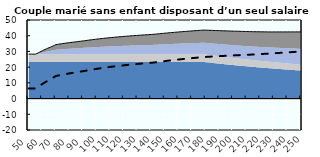
| Category | Coin fiscal moyen (somme des composantes) | Taux moyen d'imposition net en % du salaire brut |
|---|---|---|
| 50.0 | 28.259 | 6.45 |
| 51.0 | 28.259 | 6.45 |
| 52.0 | 28.259 | 6.45 |
| 53.0 | 28.259 | 6.45 |
| 54.0 | 28.259 | 6.45 |
| 55.0 | 28.259 | 6.45 |
| 56.0 | 28.616 | 6.915 |
| 57.0 | 29.094 | 7.539 |
| 58.0 | 29.556 | 8.141 |
| 59.0 | 30.003 | 8.723 |
| 60.0 | 30.434 | 9.286 |
| 61.0 | 30.851 | 9.83 |
| 62.0 | 31.255 | 10.357 |
| 63.0 | 31.646 | 10.867 |
| 64.0 | 32.025 | 11.361 |
| 65.0 | 32.392 | 11.84 |
| 66.0 | 32.749 | 12.304 |
| 67.0 | 33.113 | 12.779 |
| 68.0 | 33.528 | 13.32 |
| 69.0 | 33.957 | 13.879 |
| 70.0 | 34.323 | 14.357 |
| 71.0 | 34.467 | 14.545 |
| 72.0 | 34.607 | 14.727 |
| 73.0 | 34.743 | 14.905 |
| 74.0 | 34.875 | 15.078 |
| 75.0 | 35.004 | 15.246 |
| 76.0 | 35.13 | 15.409 |
| 77.0 | 35.252 | 15.569 |
| 78.0 | 35.371 | 15.724 |
| 79.0 | 35.487 | 15.876 |
| 80.0 | 35.601 | 16.023 |
| 81.0 | 35.711 | 16.167 |
| 82.0 | 35.819 | 16.308 |
| 83.0 | 35.924 | 16.445 |
| 84.0 | 36.027 | 16.579 |
| 85.0 | 36.14 | 16.726 |
| 86.0 | 36.255 | 16.877 |
| 87.0 | 36.368 | 17.024 |
| 88.0 | 36.478 | 17.167 |
| 89.0 | 36.585 | 17.307 |
| 90.0 | 36.691 | 17.444 |
| 91.0 | 36.805 | 17.594 |
| 92.0 | 36.929 | 17.756 |
| 93.0 | 37.05 | 17.914 |
| 94.0 | 37.169 | 18.068 |
| 95.0 | 37.285 | 18.22 |
| 96.0 | 37.399 | 18.368 |
| 97.0 | 37.51 | 18.513 |
| 98.0 | 37.619 | 18.656 |
| 99.0 | 37.726 | 18.795 |
| 100.0 | 37.831 | 18.932 |
| 101.0 | 37.934 | 19.066 |
| 102.0 | 38.034 | 19.197 |
| 103.0 | 38.133 | 19.326 |
| 104.0 | 38.23 | 19.452 |
| 105.0 | 38.325 | 19.576 |
| 106.0 | 38.418 | 19.697 |
| 107.0 | 38.51 | 19.816 |
| 108.0 | 38.599 | 19.934 |
| 109.0 | 38.687 | 20.048 |
| 110.0 | 38.774 | 20.161 |
| 111.0 | 38.859 | 20.272 |
| 112.0 | 38.942 | 20.381 |
| 113.0 | 39.024 | 20.488 |
| 114.0 | 39.105 | 20.593 |
| 115.0 | 39.184 | 20.696 |
| 116.0 | 39.262 | 20.797 |
| 117.0 | 39.338 | 20.897 |
| 118.0 | 39.413 | 20.995 |
| 119.0 | 39.487 | 21.091 |
| 120.0 | 39.56 | 21.186 |
| 121.0 | 39.631 | 21.279 |
| 122.0 | 39.701 | 21.371 |
| 123.0 | 39.771 | 21.461 |
| 124.0 | 39.839 | 21.549 |
| 125.0 | 39.905 | 21.637 |
| 126.0 | 39.971 | 21.723 |
| 127.0 | 40.036 | 21.807 |
| 128.0 | 40.1 | 21.89 |
| 129.0 | 40.163 | 21.972 |
| 130.0 | 40.225 | 22.053 |
| 131.0 | 40.285 | 22.132 |
| 132.0 | 40.345 | 22.211 |
| 133.0 | 40.405 | 22.288 |
| 134.0 | 40.463 | 22.363 |
| 135.0 | 40.52 | 22.438 |
| 136.0 | 40.577 | 22.512 |
| 137.0 | 40.632 | 22.584 |
| 138.0 | 40.687 | 22.656 |
| 139.0 | 40.741 | 22.727 |
| 140.0 | 40.794 | 22.796 |
| 141.0 | 40.857 | 22.878 |
| 142.0 | 40.932 | 22.976 |
| 143.0 | 41.006 | 23.072 |
| 144.0 | 41.087 | 23.178 |
| 145.0 | 41.176 | 23.294 |
| 146.0 | 41.264 | 23.409 |
| 147.0 | 41.351 | 23.522 |
| 148.0 | 41.437 | 23.633 |
| 149.0 | 41.521 | 23.744 |
| 150.0 | 41.604 | 23.852 |
| 151.0 | 41.687 | 23.959 |
| 152.0 | 41.768 | 24.065 |
| 153.0 | 41.848 | 24.169 |
| 154.0 | 41.927 | 24.272 |
| 155.0 | 42.005 | 24.374 |
| 156.0 | 42.082 | 24.475 |
| 157.0 | 42.158 | 24.574 |
| 158.0 | 42.233 | 24.671 |
| 159.0 | 42.307 | 24.768 |
| 160.0 | 42.38 | 24.864 |
| 161.0 | 42.452 | 24.958 |
| 162.0 | 42.524 | 25.051 |
| 163.0 | 42.594 | 25.143 |
| 164.0 | 42.664 | 25.234 |
| 165.0 | 42.733 | 25.323 |
| 166.0 | 42.801 | 25.412 |
| 167.0 | 42.868 | 25.499 |
| 168.0 | 42.934 | 25.586 |
| 169.0 | 43 | 25.671 |
| 170.0 | 43.064 | 25.756 |
| 171.0 | 43.128 | 25.839 |
| 172.0 | 43.192 | 25.922 |
| 173.0 | 43.254 | 26.004 |
| 174.0 | 43.316 | 26.084 |
| 175.0 | 43.377 | 26.164 |
| 176.0 | 43.438 | 26.243 |
| 177.0 | 43.497 | 26.321 |
| 178.0 | 43.556 | 26.398 |
| 179.0 | 43.561 | 26.46 |
| 180.0 | 43.528 | 26.513 |
| 181.0 | 43.496 | 26.564 |
| 182.0 | 43.464 | 26.616 |
| 183.0 | 43.432 | 26.667 |
| 184.0 | 43.4 | 26.717 |
| 185.0 | 43.369 | 26.766 |
| 186.0 | 43.338 | 26.815 |
| 187.0 | 43.307 | 26.864 |
| 188.0 | 43.276 | 26.912 |
| 189.0 | 43.246 | 26.96 |
| 190.0 | 43.216 | 27.007 |
| 191.0 | 43.186 | 27.053 |
| 192.0 | 43.156 | 27.099 |
| 193.0 | 43.127 | 27.145 |
| 194.0 | 43.098 | 27.19 |
| 195.0 | 43.069 | 27.235 |
| 196.0 | 43.04 | 27.279 |
| 197.0 | 43.012 | 27.323 |
| 198.0 | 42.984 | 27.366 |
| 199.0 | 42.956 | 27.409 |
| 200.0 | 42.928 | 27.451 |
| 201.0 | 42.901 | 27.493 |
| 202.0 | 42.873 | 27.535 |
| 203.0 | 42.846 | 27.576 |
| 204.0 | 42.819 | 27.617 |
| 205.0 | 42.793 | 27.657 |
| 206.0 | 42.766 | 27.697 |
| 207.0 | 42.74 | 27.737 |
| 208.0 | 42.714 | 27.776 |
| 209.0 | 42.688 | 27.815 |
| 210.0 | 42.662 | 27.854 |
| 211.0 | 42.637 | 27.892 |
| 212.0 | 42.611 | 27.93 |
| 213.0 | 42.586 | 27.967 |
| 214.0 | 42.57 | 28.015 |
| 215.0 | 42.557 | 28.066 |
| 216.0 | 42.544 | 28.117 |
| 217.0 | 42.531 | 28.167 |
| 218.0 | 42.518 | 28.217 |
| 219.0 | 42.505 | 28.266 |
| 220.0 | 42.492 | 28.315 |
| 221.0 | 42.479 | 28.363 |
| 222.0 | 42.467 | 28.411 |
| 223.0 | 42.454 | 28.459 |
| 224.0 | 42.442 | 28.506 |
| 225.0 | 42.43 | 28.552 |
| 226.0 | 42.417 | 28.598 |
| 227.0 | 42.405 | 28.644 |
| 228.0 | 42.396 | 28.693 |
| 229.0 | 42.398 | 28.756 |
| 230.0 | 42.4 | 28.818 |
| 231.0 | 42.402 | 28.879 |
| 232.0 | 42.404 | 28.94 |
| 233.0 | 42.406 | 29 |
| 234.0 | 42.409 | 29.06 |
| 235.0 | 42.411 | 29.119 |
| 236.0 | 42.413 | 29.178 |
| 237.0 | 42.415 | 29.237 |
| 238.0 | 42.417 | 29.294 |
| 239.0 | 42.419 | 29.352 |
| 240.0 | 42.421 | 29.409 |
| 241.0 | 42.423 | 29.465 |
| 242.0 | 42.425 | 29.521 |
| 243.0 | 42.426 | 29.576 |
| 244.0 | 42.428 | 29.631 |
| 245.0 | 42.43 | 29.686 |
| 246.0 | 42.432 | 29.74 |
| 247.0 | 42.434 | 29.794 |
| 248.0 | 42.436 | 29.847 |
| 249.0 | 42.438 | 29.9 |
| 250.0 | 42.44 | 29.952 |